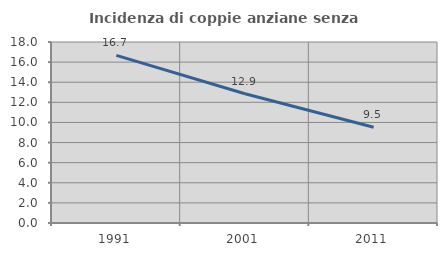
| Category | Incidenza di coppie anziane senza figli  |
|---|---|
| 1991.0 | 16.667 |
| 2001.0 | 12.857 |
| 2011.0 | 9.524 |